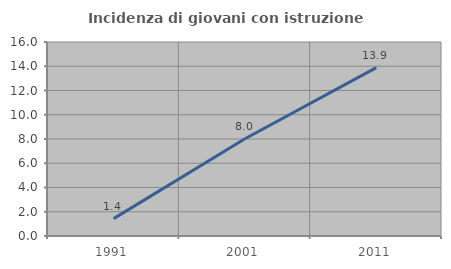
| Category | Incidenza di giovani con istruzione universitaria |
|---|---|
| 1991.0 | 1.435 |
| 2001.0 | 8.021 |
| 2011.0 | 13.889 |